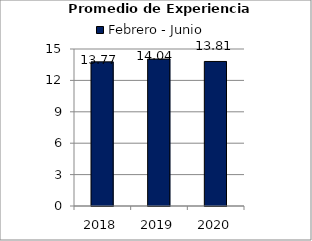
| Category | Febrero - Junio |
|---|---|
| 2018.0 | 13.77 |
| 2019.0 | 14.04 |
| 2020.0 | 13.81 |